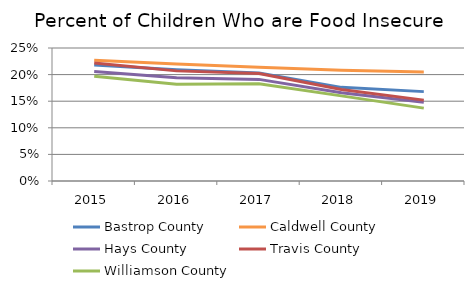
| Category | Bastrop County | Caldwell County | Hays County | Travis County | Williamson County |
|---|---|---|---|---|---|
| 2015.0 | 0.218 | 0.227 | 0.206 | 0.222 | 0.197 |
| 2016.0 | 0.209 | 0.22 | 0.194 | 0.207 | 0.182 |
| 2017.0 | 0.203 | 0.214 | 0.191 | 0.202 | 0.183 |
| 2018.0 | 0.176 | 0.208 | 0.166 | 0.172 | 0.16 |
| 2019.0 | 0.168 | 0.205 | 0.148 | 0.152 | 0.137 |